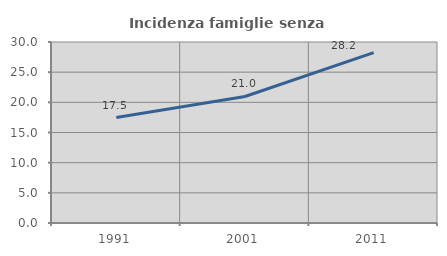
| Category | Incidenza famiglie senza nuclei |
|---|---|
| 1991.0 | 17.479 |
| 2001.0 | 20.968 |
| 2011.0 | 28.24 |